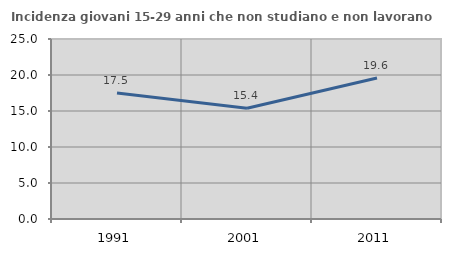
| Category | Incidenza giovani 15-29 anni che non studiano e non lavorano  |
|---|---|
| 1991.0 | 17.498 |
| 2001.0 | 15.385 |
| 2011.0 | 19.588 |